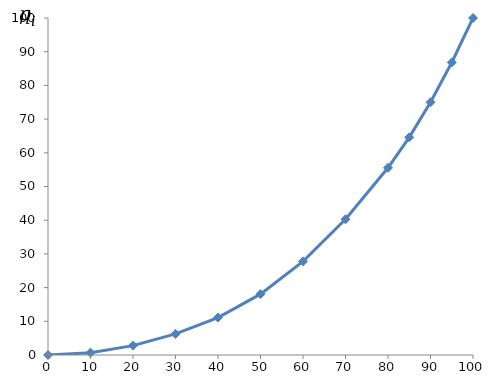
| Category | Series 0 |
|---|---|
| 0.0 | 0 |
| 10.0 | 0.694 |
| 20.0 | 2.778 |
| 30.0 | 6.25 |
| 40.0 | 11.111 |
| 50.0 | 18.056 |
| 60.0 | 27.778 |
| 70.0 | 40.278 |
| 80.0 | 55.556 |
| 85.0 | 64.583 |
| 90.0 | 75 |
| 95.0 | 86.806 |
| 100.0 | 100 |